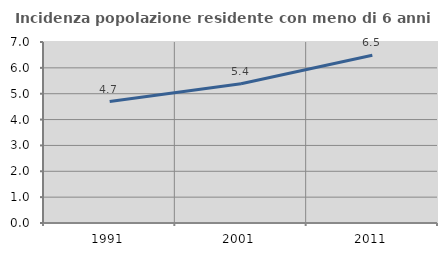
| Category | Incidenza popolazione residente con meno di 6 anni |
|---|---|
| 1991.0 | 4.698 |
| 2001.0 | 5.382 |
| 2011.0 | 6.491 |